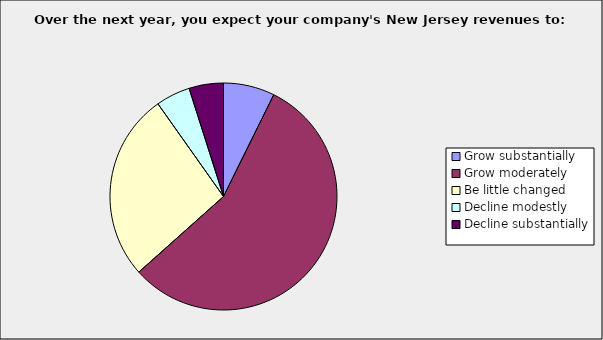
| Category | Series 0 |
|---|---|
| Grow substantially | 0.073 |
| Grow moderately | 0.561 |
| Be little changed | 0.268 |
| Decline modestly | 0.049 |
| Decline substantially | 0.049 |